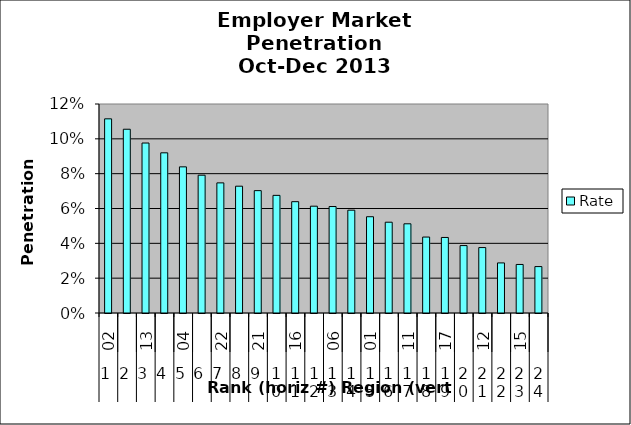
| Category | Rate |
|---|---|
| 0 | 0.111 |
| 1 | 0.106 |
| 2 | 0.098 |
| 3 | 0.092 |
| 4 | 0.084 |
| 5 | 0.079 |
| 6 | 0.075 |
| 7 | 0.073 |
| 8 | 0.07 |
| 9 | 0.068 |
| 10 | 0.064 |
| 11 | 0.061 |
| 12 | 0.061 |
| 13 | 0.059 |
| 14 | 0.055 |
| 15 | 0.052 |
| 16 | 0.051 |
| 17 | 0.044 |
| 18 | 0.043 |
| 19 | 0.039 |
| 20 | 0.038 |
| 21 | 0.029 |
| 22 | 0.028 |
| 23 | 0.027 |